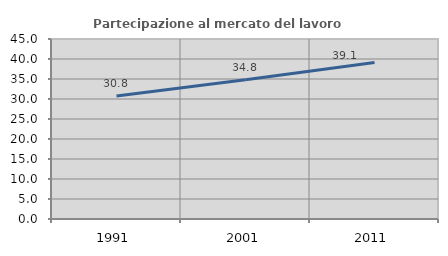
| Category | Partecipazione al mercato del lavoro  femminile |
|---|---|
| 1991.0 | 30.757 |
| 2001.0 | 34.832 |
| 2011.0 | 39.098 |